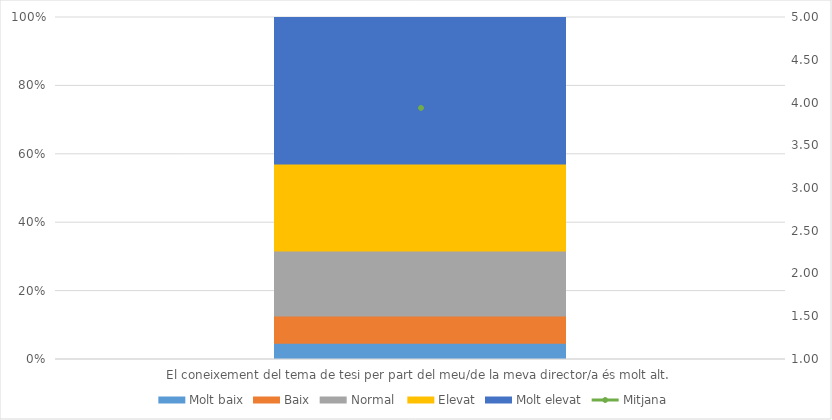
| Category | Molt baix | Baix | Normal  | Elevat | Molt elevat |
|---|---|---|---|---|---|
| El coneixement del tema de tesi per part del meu/de la meva director/a és molt alt. | 3 | 5 | 12 | 16 | 27 |